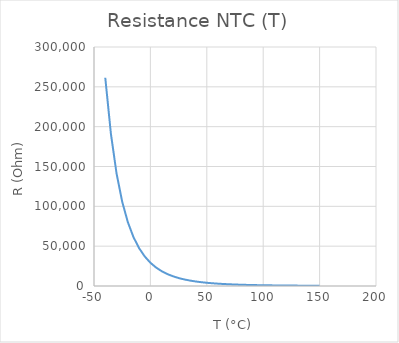
| Category | RNTC[Ohm] |
|---|---|
| -40.0 | 261379.108 |
| -35.0 | 190889.967 |
| -30.0 | 141224.045 |
| -25.0 | 105756.775 |
| -20.0 | 80106.776 |
| -15.0 | 61334.315 |
| -10.0 | 47439.993 |
| -5.0 | 37046.402 |
| 0.0 | 29193.038 |
| 5.0 | 23202.372 |
| 10.0 | 18591.234 |
| 15.0 | 15011.478 |
| 20.0 | 12209.761 |
| 25.0 | 10000 |
| 30.0 | 8244.286 |
| 35.0 | 6839.542 |
| 40.0 | 5708.102 |
| 45.0 | 4790.985 |
| 50.0 | 4043.076 |
| 55.0 | 3429.615 |
| 60.0 | 2923.64 |
| 65.0 | 2504.105 |
| 70.0 | 2154.475 |
| 75.0 | 1861.686 |
| 80.0 | 1615.354 |
| 85.0 | 1407.181 |
| 90.0 | 1230.501 |
| 95.0 | 1079.933 |
| 100.0 | 951.11 |
| 105.0 | 840.473 |
| 110.0 | 745.107 |
| 115.0 | 662.614 |
| 120.0 | 591.015 |
| 125.0 | 528.67 |
| 130.0 | 474.21 |
| 135.0 | 426.495 |
| 140.0 | 384.567 |
| 145.0 | 347.62 |
| 150.0 | 314.974 |